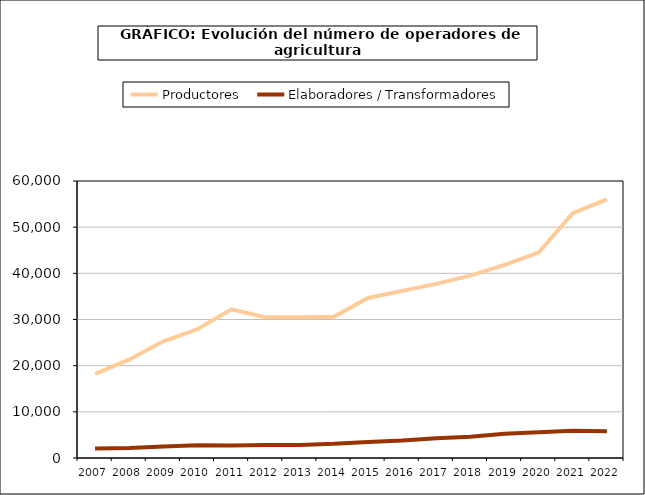
| Category | Productores | Elaboradores / Transformadores |
|---|---|---|
| 2007.0 | 18226 | 2061 |
| 2008.0 | 21291 | 2168 |
| 2009.0 | 25291 | 2465 |
| 2010.0 | 27877 | 2747 |
| 2011.0 | 32206 | 2729 |
| 2012.0 | 30462 | 2790 |
| 2013.0 | 30502 | 2842 |
| 2014.0 | 30602 | 3082 |
| 2015.0 | 34673 | 3492 |
| 2016.0 | 36207 | 3810 |
| 2017.0 | 37712 | 4297 |
| 2018.0 | 39505 | 4627 |
| 2019.0 | 41838 | 5230 |
| 2020.0 | 44493 | 5561 |
| 2021.0 | 53029 | 5921 |
| 2022.0 | 56024 | 5773 |